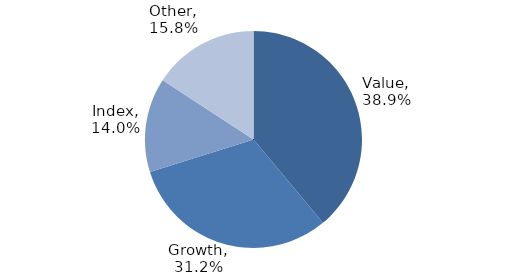
| Category | Investment Style |
|---|---|
| Value | 0.389 |
| Growth | 0.312 |
| Index | 0.14 |
| Other | 0.158 |